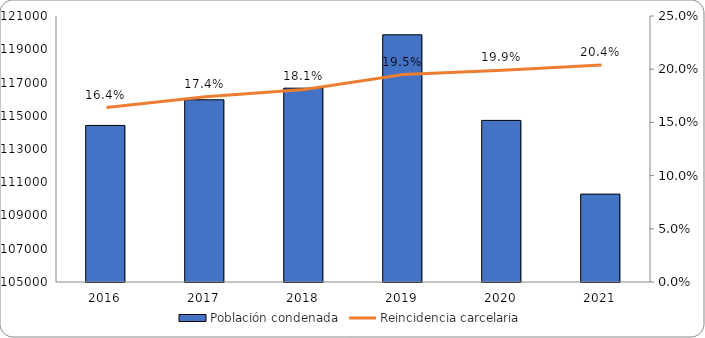
| Category | Población condenada |
|---|---|
| 2016.0 | 114417 |
| 2017.0 | 115961 |
| 2018.0 | 116659 |
| 2019.0 | 119870 |
| 2020.0 | 114720 |
| 2021.0 | 110287 |